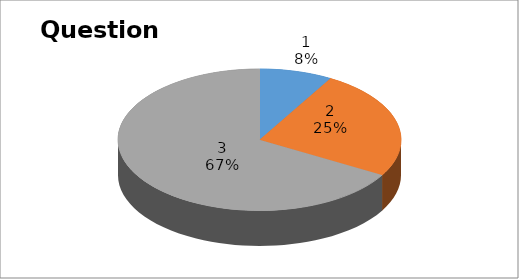
| Category | Series 0 |
|---|---|
| 0 | 3 |
| 1 | 9 |
| 2 | 24 |